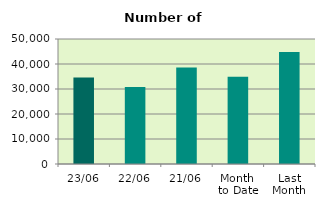
| Category | Series 0 |
|---|---|
| 23/06 | 34640 |
| 22/06 | 30848 |
| 21/06 | 38564 |
| Month 
to Date | 34882.706 |
| Last
Month | 44751.81 |